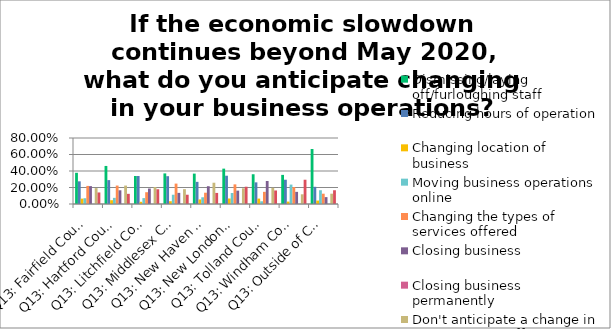
| Category | Dismissing/laying off/furloughing staff | Reducing hours of operation | Changing location of business | Moving business operations online | Changing the types of services offered | Closing business | Closing business permanently | Don't anticipate a change in operation or staffing | Other (please specify) |
|---|---|---|---|---|---|---|---|---|---|
| Q13: Fairfield County | 0.378 | 0.275 | 0.065 | 0.07 | 0.219 | 0.217 | 0 | 0.193 | 0.14 |
| Q13: Hartford County | 0.461 | 0.289 | 0.046 | 0.074 | 0.224 | 0.166 | 0 | 0.224 | 0.123 |
| Q13: Litchfield County | 0.339 | 0.339 | 0.027 | 0.071 | 0.143 | 0.188 | 0 | 0.205 | 0.179 |
| Q13: Middlesex County | 0.371 | 0.337 | 0.034 | 0.112 | 0.247 | 0.135 | 0 | 0.18 | 0.112 |
| Q13: New Haven County | 0.368 | 0.268 | 0.055 | 0.082 | 0.137 | 0.216 | 0 | 0.258 | 0.134 |
| Q13: New London County | 0.429 | 0.343 | 0.067 | 0.133 | 0.238 | 0.162 | 0 | 0.19 | 0.21 |
| Q13: Tolland County | 0.361 | 0.262 | 0.066 | 0.033 | 0.148 | 0.279 | 0 | 0.197 | 0.164 |
| Q13: Windham County | 0.353 | 0.294 | 0.029 | 0.235 | 0.206 | 0.147 | 0 | 0.118 | 0.294 |
| Q13: Outside of Connecticut | 0.667 | 0.208 | 0.042 | 0.167 | 0.125 | 0.083 | 0 | 0.125 | 0.167 |